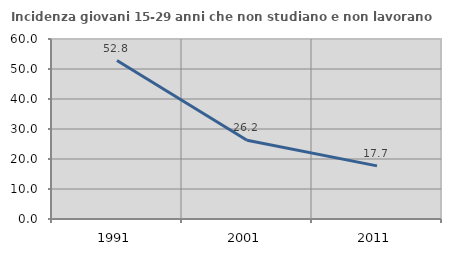
| Category | Incidenza giovani 15-29 anni che non studiano e non lavorano  |
|---|---|
| 1991.0 | 52.809 |
| 2001.0 | 26.241 |
| 2011.0 | 17.699 |